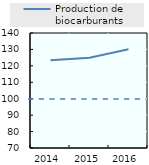
| Category | Production de biocarburants |
|---|---|
| 2014.0 | 123.408 |
| 2015.0 | 124.896 |
| 2016.0 | 130.062 |